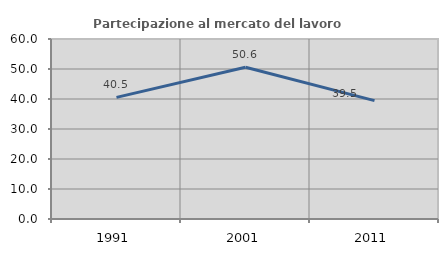
| Category | Partecipazione al mercato del lavoro  femminile |
|---|---|
| 1991.0 | 40.541 |
| 2001.0 | 50.602 |
| 2011.0 | 39.474 |